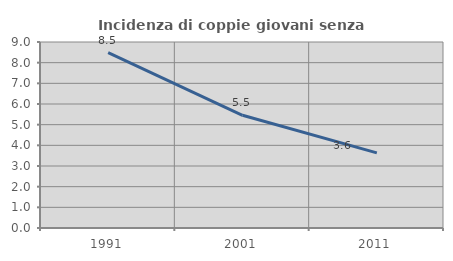
| Category | Incidenza di coppie giovani senza figli |
|---|---|
| 1991.0 | 8.485 |
| 2001.0 | 5.455 |
| 2011.0 | 3.636 |